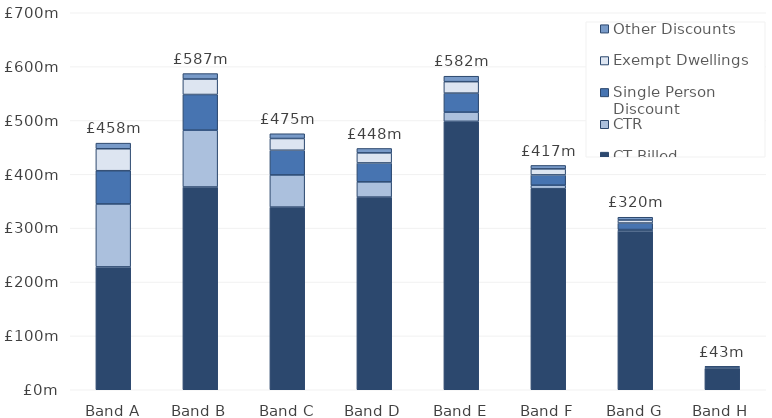
| Category | CT Billed | CTR | Single Person Discount | Exempt Dwellings | Other Discounts |
|---|---|---|---|---|---|
| Band A | 228.117 | 116.836 | 61.788 | 40.739 | 10.428 |
| Band B | 376.446 | 105.535 | 66.234 | 28.718 | 10.146 |
| Band C | 339.138 | 59.69 | 45.918 | 21.768 | 8.846 |
| Band D | 357.717 | 28.234 | 35.23 | 18.634 | 8.219 |
| Band E | 498.389 | 17.021 | 35.38 | 21.262 | 10.103 |
| Band F | 373.34 | 6.427 | 19.156 | 11.167 | 6.454 |
| Band G | 294.946 | 2.553 | 12.077 | 5.556 | 5.16 |
| Band H | 39.015 | 0.127 | 1.18 | 1.637 | 1.5 |